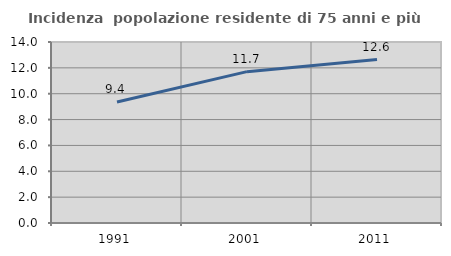
| Category | Incidenza  popolazione residente di 75 anni e più |
|---|---|
| 1991.0 | 9.359 |
| 2001.0 | 11.706 |
| 2011.0 | 12.638 |